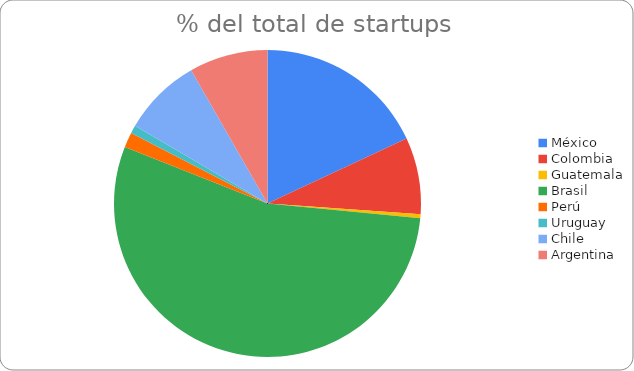
| Category | Número de startups, capital recaudado y valor del ecosistema por país (2021) |
|---|---|
| México | 0.18 |
| Colombia | 0.081 |
| Guatemala | 0.004 |
| Brasil | 0.545 |
| Perú | 0.016 |
| Uruguay | 0.008 |
| Chile | 0.083 |
| Argentina | 0.083 |